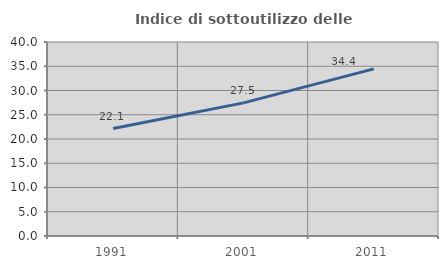
| Category | Indice di sottoutilizzo delle abitazioni  |
|---|---|
| 1991.0 | 22.147 |
| 2001.0 | 27.453 |
| 2011.0 | 34.45 |